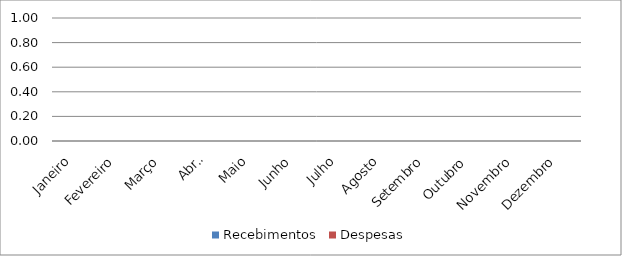
| Category | Recebimentos | Despesas |
|---|---|---|
| Janeiro | 0 | 0 |
| Fevereiro | 0 | 0 |
| Março | 0 | 0 |
| Abril | 0 | 0 |
| Maio | 0 | 0 |
| Junho | 0 | 0 |
| Julho | 0 | 0 |
| Agosto | 0 | 0 |
| Setembro | 0 | 0 |
| Outubro | 0 | 0 |
| Novembro | 0 | 0 |
| Dezembro | 0 | 0 |